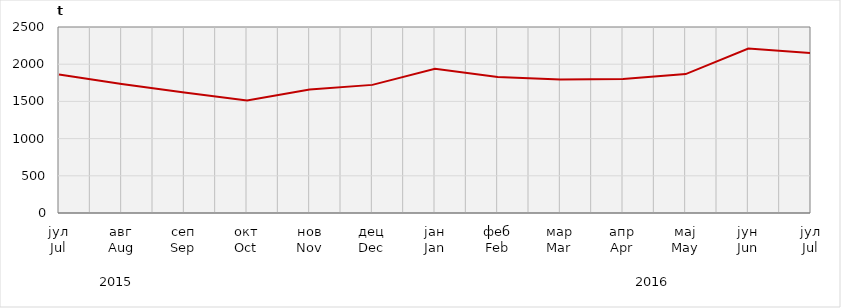
| Category | Нето тежина заклане стоке                              Net weight of  slaughtered livestock |
|---|---|
| јул
Jul | 1862492.5 |
| авг
Aug | 1733294.8 |
| сеп
Sep | 1619599 |
| окт
Oct | 1511667.7 |
| нов
Nov | 1658700 |
| дец
Dec | 1721996.5 |
| јан
Jan | 1938649.7 |
| феб
Feb | 1828587.85 |
| мар
Mar | 1792740.7 |
| апр
Apr | 1800600 |
| мај
May | 1866665 |
| јун
Jun | 2210576.92 |
| јул
Jul | 2148617 |